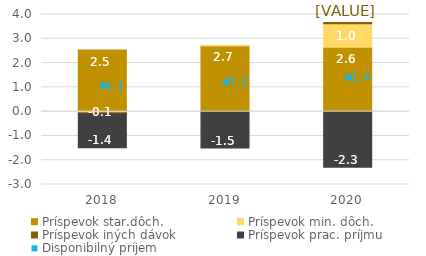
| Category | Príspevok star.dôch. | Príspevok min. dôch. | Príspevok iných dávok | Príspevok prac. príjmu |
|---|---|---|---|---|
| 2018.0 | 2.537 | -0.05 | -0.034 | -1.399 |
| 2019.0 | 2.707 | 0.005 | -0.011 | -1.488 |
| 2020.0 | 2.648 | 0.971 | 0.055 | -2.285 |